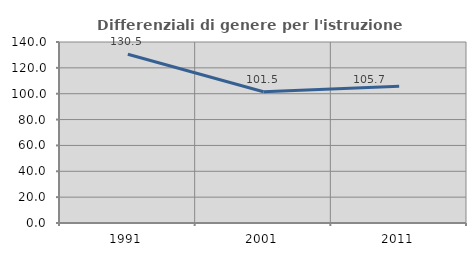
| Category | Differenziali di genere per l'istruzione superiore |
|---|---|
| 1991.0 | 130.503 |
| 2001.0 | 101.541 |
| 2011.0 | 105.685 |